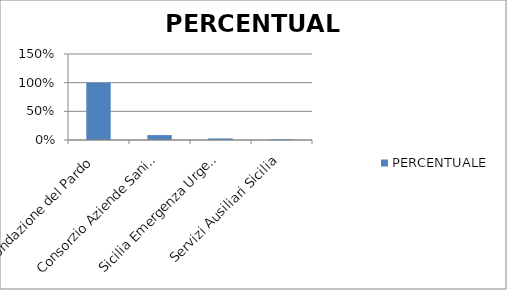
| Category | PERCENTUALE |
|---|---|
| Fondazione del Pardo | 1 |
| Consorzio Aziende Sanitarie Siciliane | 0.086 |
| Sicilia Emergenza Urgenza Sanitaria | 0.028 |
| Servizi Ausiliari Sicilia | 0.012 |